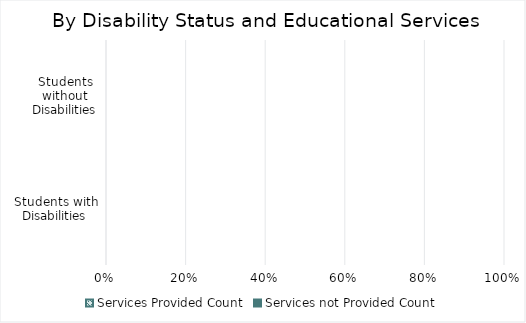
| Category | Services Provided Count | Services not Provided Count |
|---|---|---|
| Students with Disabilities | 0 | 0 |
| Students without Disabilities | 0 | 0 |